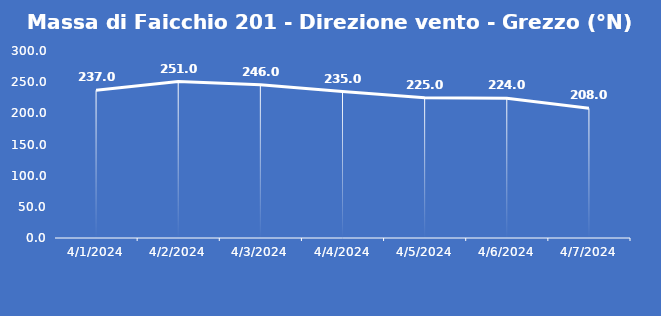
| Category | Massa di Faicchio 201 - Direzione vento - Grezzo (°N) |
|---|---|
| 4/1/24 | 237 |
| 4/2/24 | 251 |
| 4/3/24 | 246 |
| 4/4/24 | 235 |
| 4/5/24 | 225 |
| 4/6/24 | 224 |
| 4/7/24 | 208 |